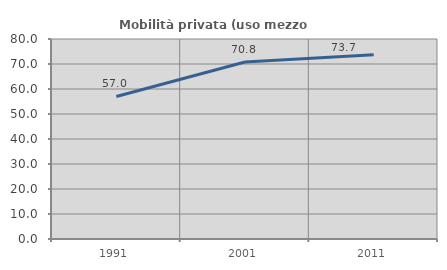
| Category | Mobilità privata (uso mezzo privato) |
|---|---|
| 1991.0 | 57.029 |
| 2001.0 | 70.826 |
| 2011.0 | 73.727 |